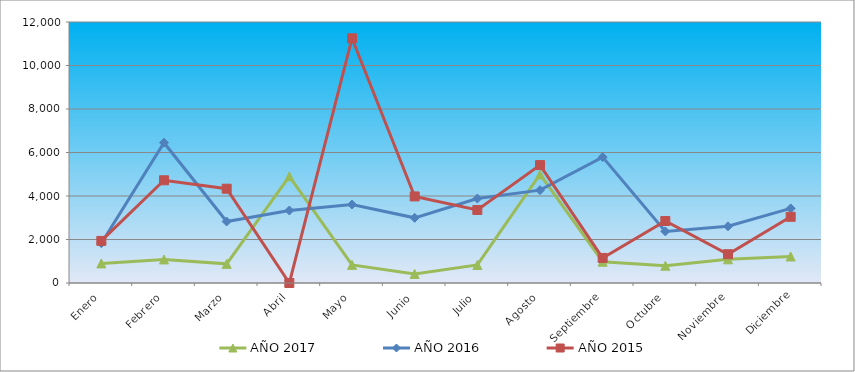
| Category | AÑO 2017 | AÑO 2016 | AÑO 2015 |
|---|---|---|---|
| Enero | 901.991 | 1829.037 | 1936.367 |
| Febrero | 1083.672 | 6449.732 | 4722.584 |
| Marzo | 880.617 | 2827.146 | 4335.311 |
| Abril | 4905.044 | 3334.276 | 0 |
| Mayo | 833.594 | 3606.082 | 11250.16 |
| Junio | 418.934 | 2996.251 | 3980.31 |
| Julio | 829.319 | 3881.58 | 3356.37 |
| Agosto | 4993.287 | 4269.005 | 5421.828 |
| Septiembre | 978.939 | 5786.37 | 1151.063 |
| Octubre | 792.983 | 2372.844 | 2850.763 |
| Noviembre | 1087.947 | 2607.268 | 1323.184 |
| Diciembre | 1220.467 | 3429.199 | 3044.4 |